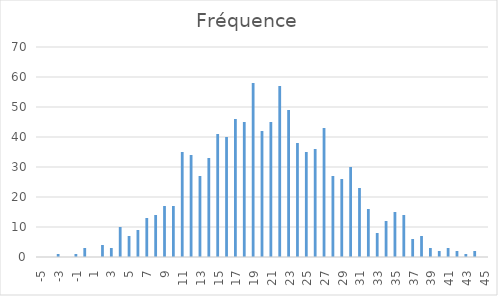
| Category | Fréquence |
|---|---|
| -5.0 | 0 |
| -4.0 | 0 |
| -3.0 | 1 |
| -2.0 | 0 |
| -1.0 | 1 |
| 0.0 | 3 |
| 1.0 | 0 |
| 2.0 | 4 |
| 3.0 | 3 |
| 4.0 | 10 |
| 5.0 | 7 |
| 6.0 | 9 |
| 7.0 | 13 |
| 8.0 | 14 |
| 9.0 | 17 |
| 10.0 | 17 |
| 11.0 | 35 |
| 12.0 | 34 |
| 13.0 | 27 |
| 14.0 | 33 |
| 15.0 | 41 |
| 16.0 | 40 |
| 17.0 | 46 |
| 18.0 | 45 |
| 19.0 | 58 |
| 20.0 | 42 |
| 21.0 | 45 |
| 22.0 | 57 |
| 23.0 | 49 |
| 24.0 | 38 |
| 25.0 | 35 |
| 26.0 | 36 |
| 27.0 | 43 |
| 28.0 | 27 |
| 29.0 | 26 |
| 30.0 | 30 |
| 31.0 | 23 |
| 32.0 | 16 |
| 33.0 | 8 |
| 34.0 | 12 |
| 35.0 | 15 |
| 36.0 | 14 |
| 37.0 | 6 |
| 38.0 | 7 |
| 39.0 | 3 |
| 40.0 | 2 |
| 41.0 | 3 |
| 42.0 | 2 |
| 43.0 | 1 |
| 44.0 | 2 |
| 45.0 | 0 |